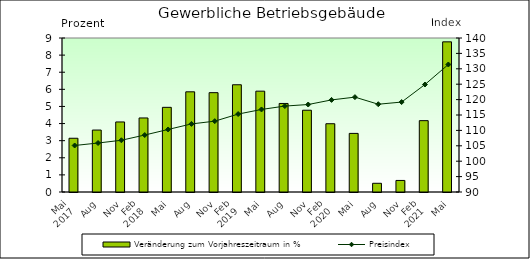
| Category | Veränderung zum Vorjahreszeitraum in % |
|---|---|
| 0 | 3.14 |
| 1 | 3.62 |
| 2 | 4.094 |
| 3 | 4.327 |
| 4 | 4.948 |
| 5 | 5.855 |
| 6 | 5.805 |
| 7 | 6.267 |
| 8 | 5.893 |
| 9 | 5.174 |
| 10 | 4.779 |
| 11 | 3.99 |
| 12 | 3.425 |
| 13 | 0.509 |
| 14 | 0.676 |
| 15 | 4.17 |
| 16 | 8.775 |